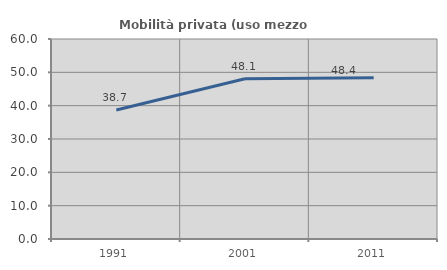
| Category | Mobilità privata (uso mezzo privato) |
|---|---|
| 1991.0 | 38.715 |
| 2001.0 | 48.081 |
| 2011.0 | 48.396 |